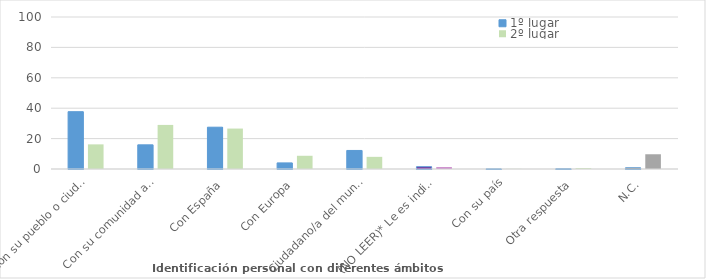
| Category | 1º lugar | 2º lugar |
|---|---|---|
| Con su pueblo o ciudad | 37.7 | 16.2 |
| Con su comunidad autónoma | 15.9 | 29 |
| Con España | 27.5 | 26.6 |
| Con Europa | 4 | 8.7 |
| Ciudadano/a del mundo | 12.2 | 8 |
| (NO LEER)* Le es indiferente | 1.5 | 1.2 |
| Con su país | 0.1 | 0.1 |
| Otra respuesta | 0.2 | 0.6 |
| N.C. | 0.8 | 9.7 |